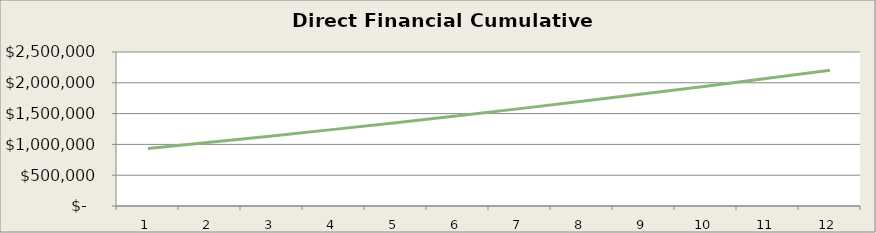
| Category | Series 0 |
|---|---|
| 0 | 935027.289 |
| 1 | 1035083.635 |
| 2 | 1138035.098 |
| 3 | 1243999.584 |
| 4 | 1353008.406 |
| 5 | 1465300.478 |
| 6 | 1580680.332 |
| 7 | 1699080.155 |
| 8 | 1820429.636 |
| 9 | 1944758.046 |
| 10 | 2072115.549 |
| 11 | 2202607.293 |